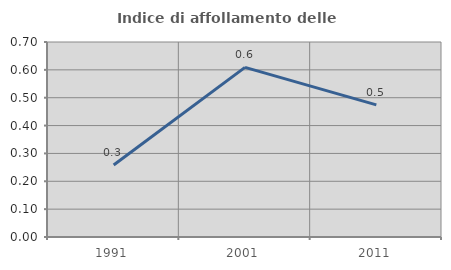
| Category | Indice di affollamento delle abitazioni  |
|---|---|
| 1991.0 | 0.259 |
| 2001.0 | 0.609 |
| 2011.0 | 0.474 |